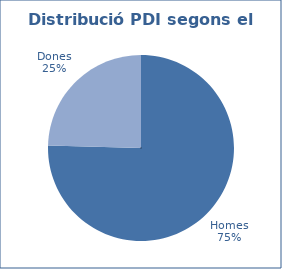
| Category | Series 0 |
|---|---|
| Homes | 1925 |
| Dones | 627 |